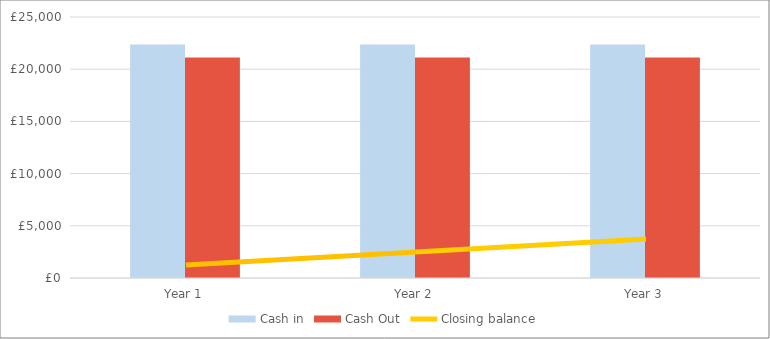
| Category | Cash in | Cash Out |
|---|---|---|
| Year 1 | 22360 | 21116.826 |
| Year 2 | 22360 | 21116.826 |
| Year 3 | 22360 | 21116.826 |